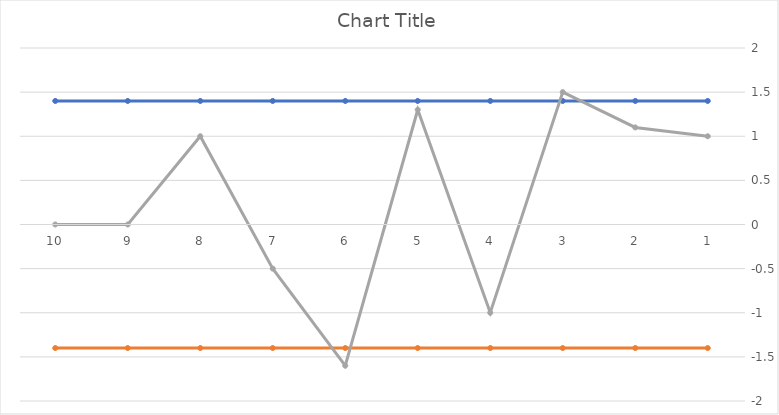
| Category | Series 0 | Series 1 | Series 2 |
|---|---|---|---|
| 1.0 | 1.4 | -1.4 | 1 |
| 2.0 | 1.4 | -1.4 | 1.1 |
| 3.0 | 1.4 | -1.4 | 1.5 |
| 4.0 | 1.4 | -1.4 | -1 |
| 5.0 | 1.4 | -1.4 | 1.3 |
| 6.0 | 1.4 | -1.4 | -1.6 |
| 7.0 | 1.4 | -1.4 | -0.5 |
| 8.0 | 1.4 | -1.4 | 1 |
| 9.0 | 1.4 | -1.4 | 0 |
| 10.0 | 1.4 | -1.4 | 0 |